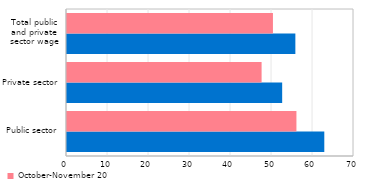
| Category | October-November 2019 | October-November 2018 |
|---|---|---|
| Public sector | 62.756 | 55.96 |
| Private sector | 52.482 | 47.461 |
| Total public
and private
sector wage | 55.698 | 50.229 |